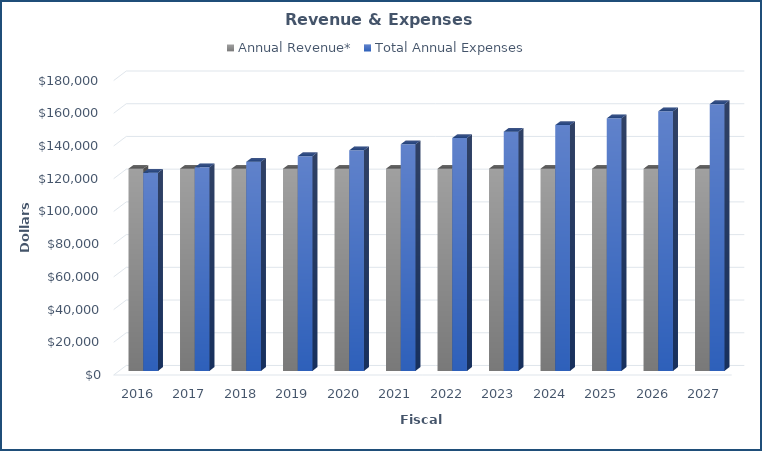
| Category | Annual Revenue* | Total Annual Expenses |
|---|---|---|
| 2016.0 | 123590.32 | 121148.69 |
| 2017.0 | 123590.32 | 124420.994 |
| 2018.0 | 123590.32 | 127791.124 |
| 2019.0 | 123590.32 | 131262.358 |
| 2020.0 | 123590.32 | 134837.728 |
| 2021.0 | 123590.32 | 138520.36 |
| 2022.0 | 123590.32 | 142313.471 |
| 2023.0 | 123590.32 | 146220.375 |
| 2024.0 | 123590.32 | 150244.486 |
| 2025.0 | 123590.32 | 154389.321 |
| 2026.0 | 123590.32 | 158658.501 |
| 2027.0 | 123590.32 | 163055.756 |